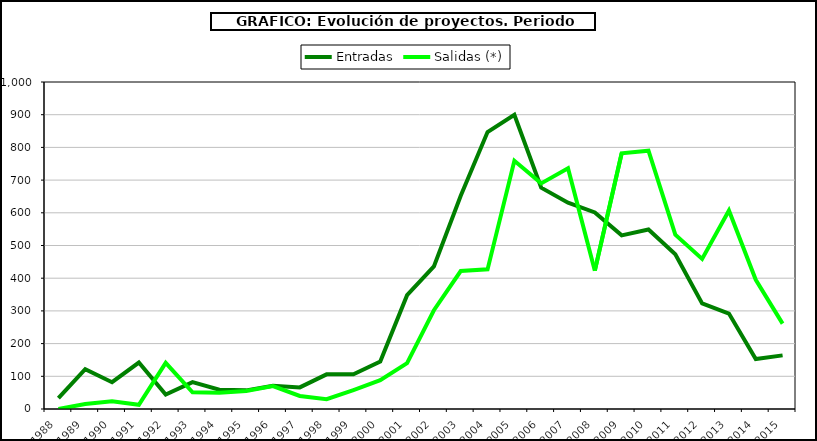
| Category | Entradas | Salidas (*) |
|---|---|---|
| 1988.0 | 33 | 0 |
| 1989.0 | 122 | 15 |
| 1990.0 | 82 | 24 |
| 1991.0 | 142 | 13 |
| 1992.0 | 44 | 141 |
| 1993.0 | 82 | 51 |
| 1994.0 | 59 | 50 |
| 1995.0 | 57 | 55 |
| 1996.0 | 71 | 70 |
| 1997.0 | 66 | 40 |
| 1998.0 | 106 | 30 |
| 1999.0 | 106 | 58 |
| 2000.0 | 145 | 88 |
| 2001.0 | 348 | 140 |
| 2002.0 | 436 | 302 |
| 2003.0 | 652 | 422 |
| 2004.0 | 847 | 427 |
| 2005.0 | 900 | 759 |
| 2006.0 | 677 | 690 |
| 2007.0 | 631 | 736 |
| 2008.0 | 601 | 423 |
| 2009.0 | 531 | 782 |
| 2010.0 | 549 | 790 |
| 2011.0 | 473 | 533 |
| 2012.0 | 323 | 459 |
| 2013.0 | 292 | 607 |
| 2014.0 | 153 | 395 |
| 2015.0 | 164 | 261 |